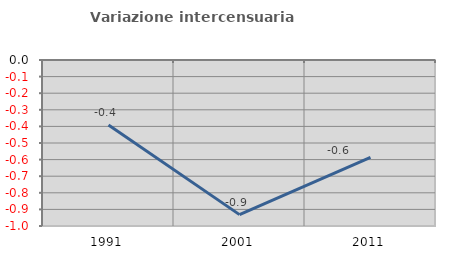
| Category | Variazione intercensuaria annua |
|---|---|
| 1991.0 | -0.391 |
| 2001.0 | -0.932 |
| 2011.0 | -0.586 |